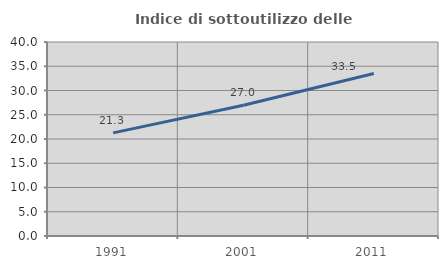
| Category | Indice di sottoutilizzo delle abitazioni  |
|---|---|
| 1991.0 | 21.258 |
| 2001.0 | 26.968 |
| 2011.0 | 33.5 |